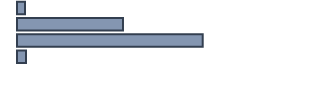
| Category | Series 0 |
|---|---|
| 0 | 2.6 |
| 1 | 34.3 |
| 2 | 60.1 |
| 3 | 2.9 |
| 4 | 0 |